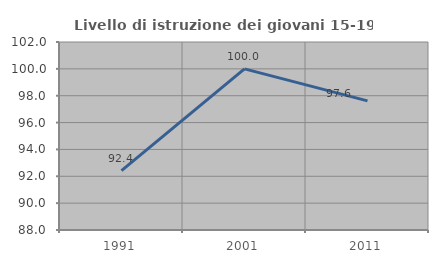
| Category | Livello di istruzione dei giovani 15-19 anni |
|---|---|
| 1991.0 | 92.424 |
| 2001.0 | 100 |
| 2011.0 | 97.619 |